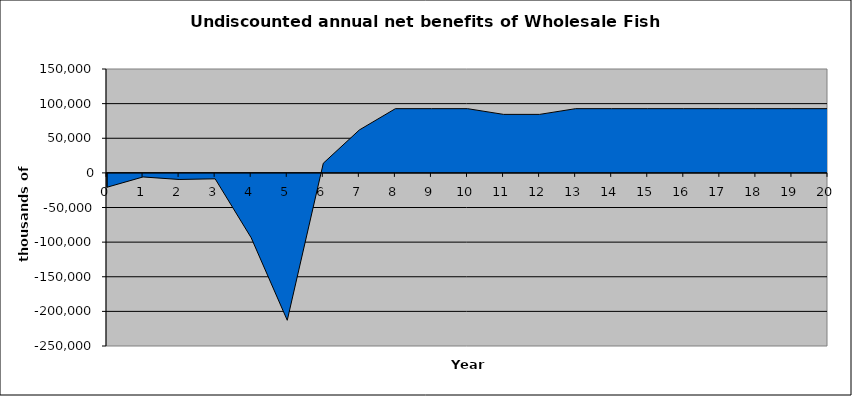
| Category | Series 0 |
|---|---|
| 0.0 | -20743.463 |
| 1.0 | -5897.04 |
| 2.0 | -9538.99 |
| 3.0 | -8556.629 |
| 4.0 | -93739.225 |
| 5.0 | -212874.086 |
| 6.0 | 13934.161 |
| 7.0 | 62003.074 |
| 8.0 | 92712.692 |
| 9.0 | 92712.692 |
| 10.0 | 92712.692 |
| 11.0 | 84464.692 |
| 12.0 | 84464.692 |
| 13.0 | 92712.692 |
| 14.0 | 92712.692 |
| 15.0 | 92712.692 |
| 16.0 | 92712.692 |
| 17.0 | 92712.692 |
| 18.0 | 92712.692 |
| 19.0 | 92712.692 |
| 20.0 | 92712.692 |